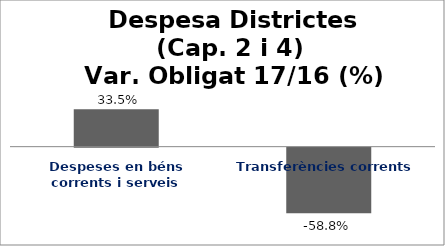
| Category | Series 0 |
|---|---|
| Despeses en béns corrents i serveis | 0.335 |
| Transferències corrents | -0.588 |